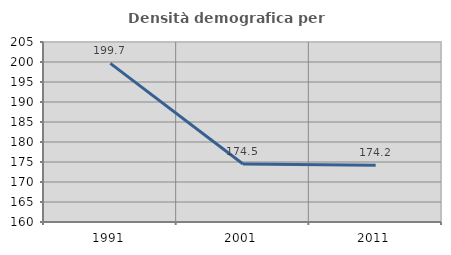
| Category | Densità demografica |
|---|---|
| 1991.0 | 199.658 |
| 2001.0 | 174.511 |
| 2011.0 | 174.16 |